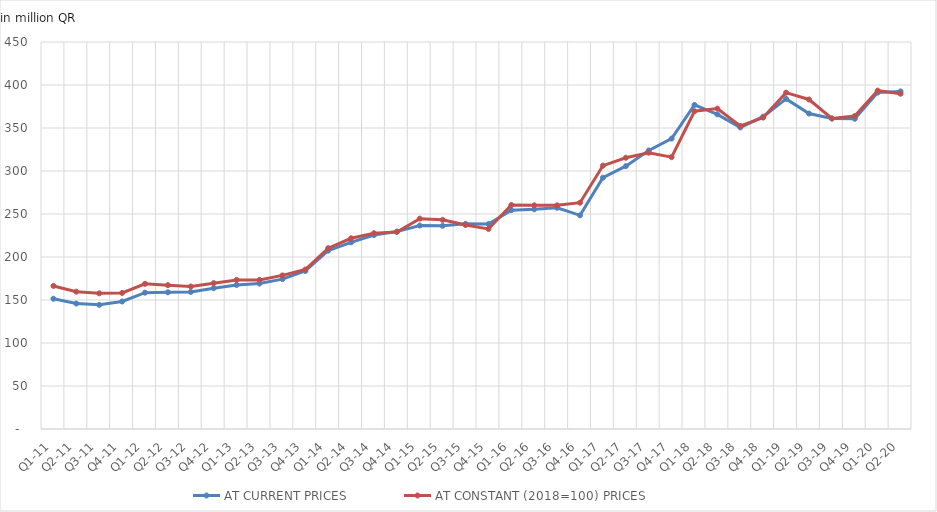
| Category | AT CURRENT PRICES | AT CONSTANT (2018=100) PRICES |
|---|---|---|
| Q1-11 | 151.488 | 166.372 |
| Q2-11 | 145.866 | 159.713 |
| Q3-11 | 144.351 | 157.743 |
| Q4-11 | 148.271 | 158.198 |
| Q1-12 | 158.532 | 168.804 |
| Q2-12 | 158.962 | 167.237 |
| Q3-12 | 159.372 | 165.655 |
| Q4-12 | 163.739 | 169.6 |
| Q1-13 | 167.504 | 173.339 |
| Q2-13 | 169.132 | 173.35 |
| Q3-13 | 174.241 | 178.597 |
| Q4-13 | 183.722 | 185.429 |
| Q1-14 | 207.366 | 210.265 |
| Q2-14 | 217.066 | 221.76 |
| Q3-14 | 225.547 | 227.674 |
| Q4-14 | 229.555 | 229.135 |
| Q1-15 | 236.59 | 244.589 |
| Q2-15 | 236.277 | 243.22 |
| Q3-15 | 238.535 | 237.169 |
| Q4-15 | 238.334 | 232.662 |
| Q1-16 | 254.402 | 260.465 |
| Q2-16 | 255.485 | 260.082 |
| Q3-16 | 257.192 | 260.051 |
| Q4-16 | 248.458 | 263.145 |
| Q1-17 | 292.189 | 306.247 |
| Q2-17 | 305.591 | 315.418 |
| Q3-17 | 323.793 | 321.267 |
| Q4-17 | 337.674 | 316.097 |
| Q1-18 | 376.825 | 369.457 |
| Q2-18 | 365.857 | 372.539 |
| Q3-18 | 350.611 | 352.387 |
| Q4-18 | 363.225 | 362.136 |
| Q1-19 | 383.818 | 391.117 |
| Q2-19 | 366.811 | 383.169 |
| Q3-19 | 361.018 | 361.112 |
| Q4-19 | 360.728 | 363.915 |
| Q1-20 | 391.186 | 393.512 |
| Q2-20 | 392.573 | 389.841 |